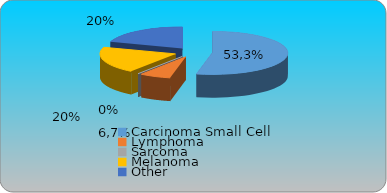
| Category | Series 0 | Series 1 | Series 2 | Series 3 |
|---|---|---|---|---|
| Carcinoma Small Cell | 0.533 |  |  |  |
| Lymphoma | 0.067 |  |  |  |
| Sarcoma | 0 |  |  |  |
| Melanoma | 0.2 |  |  |  |
| Other | 0.2 |  |  |  |